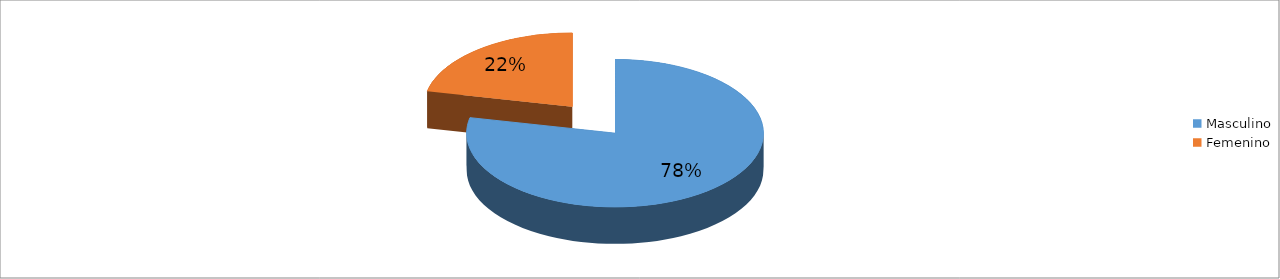
| Category | Series 0 |
|---|---|
| Masculino | 0.784 |
| Femenino | 0.216 |